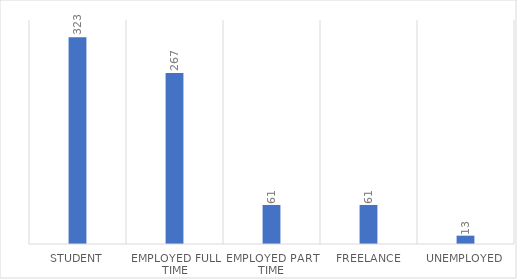
| Category | Series 0 |
|---|---|
| Student | 323 |
| Employed full time | 267 |
| Employed part time | 61 |
| Freelance | 61 |
| Unemployed | 13 |